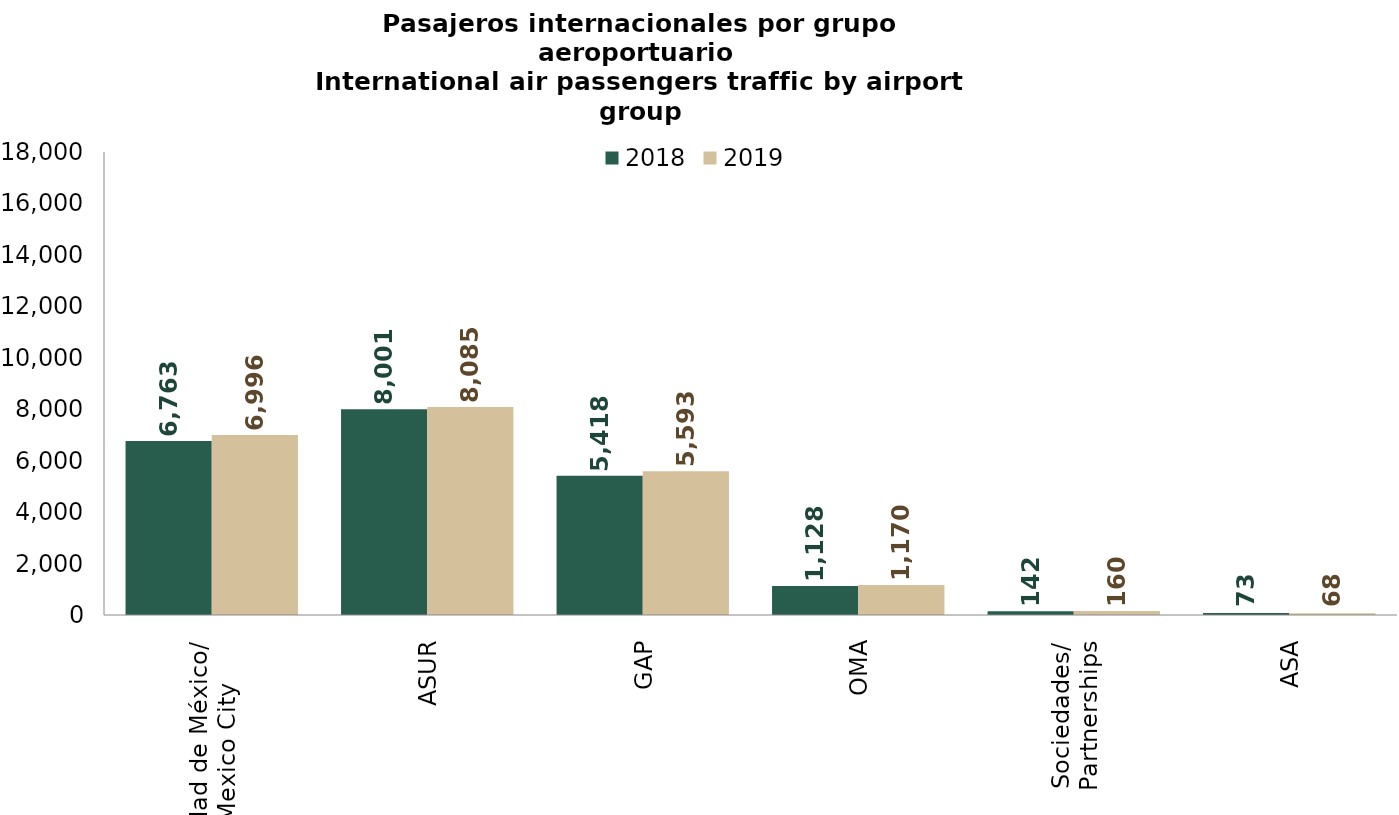
| Category | 2018 | 2019 |
|---|---|---|
| Ciudad de México/
Mexico City | 6763.339 | 6995.889 |
| ASUR | 8001.131 | 8085.347 |
| GAP | 5417.636 | 5593.132 |
| OMA | 1128.126 | 1170.1 |
| Sociedades/
Partnerships | 141.834 | 159.943 |
| ASA | 73.039 | 68.237 |